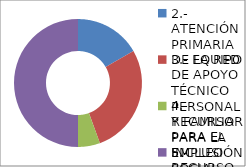
| Category | Series 0 |
|---|---|
| 2.- ATENCIÓN PRIMARIA DE LA RED | 3 |
| 3.- EQUIPO DE APOYO TÉCNICO PERSONAL Y FAMILIAR PARA LA INCLUSIÓN SOCIAL | 5 |
| 4.- RECURSO PARA EL EMPLEO | 1 |
| 5.- RECURSO DE ALOJAMIENTO PARA LA INCLUSIÓN | 9 |